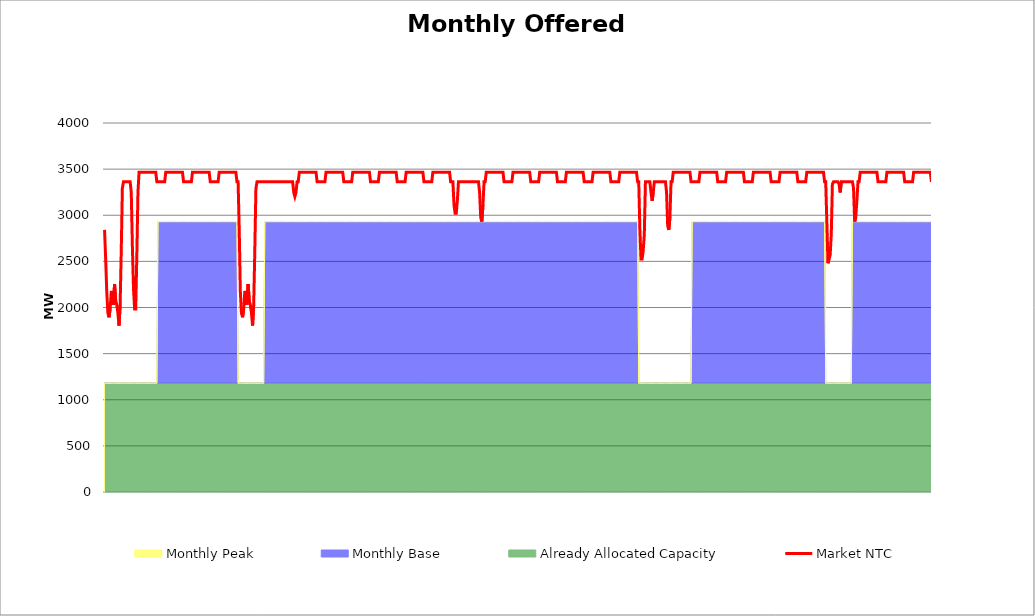
| Category | Market NTC |
|---|---|
| 0 | 2841 |
| 1 | 2525 |
| 2 | 2164 |
| 3 | 1939 |
| 4 | 1894 |
| 5 | 1984 |
| 6 | 2164 |
| 7 | 2164 |
| 8 | 2029 |
| 9 | 2255 |
| 10 | 2074 |
| 11 | 2029 |
| 12 | 1939 |
| 13 | 1804 |
| 14 | 2029 |
| 15 | 2615 |
| 16 | 3292 |
| 17 | 3362 |
| 18 | 3362 |
| 19 | 3362 |
| 20 | 3362 |
| 21 | 3362 |
| 22 | 3362 |
| 23 | 3362 |
| 24 | 3247 |
| 25 | 2661 |
| 26 | 2210 |
| 27 | 1984 |
| 28 | 1984 |
| 29 | 2570 |
| 30 | 3247 |
| 31 | 3466 |
| 32 | 3466 |
| 33 | 3466 |
| 34 | 3466 |
| 35 | 3466 |
| 36 | 3466 |
| 37 | 3466 |
| 38 | 3466 |
| 39 | 3466 |
| 40 | 3466 |
| 41 | 3466 |
| 42 | 3466 |
| 43 | 3466 |
| 44 | 3466 |
| 45 | 3466 |
| 46 | 3466 |
| 47 | 3362 |
| 48 | 3362 |
| 49 | 3362 |
| 50 | 3362 |
| 51 | 3362 |
| 52 | 3362 |
| 53 | 3362 |
| 54 | 3362 |
| 55 | 3466 |
| 56 | 3466 |
| 57 | 3466 |
| 58 | 3466 |
| 59 | 3466 |
| 60 | 3466 |
| 61 | 3466 |
| 62 | 3466 |
| 63 | 3466 |
| 64 | 3466 |
| 65 | 3466 |
| 66 | 3466 |
| 67 | 3466 |
| 68 | 3466 |
| 69 | 3466 |
| 70 | 3466 |
| 71 | 3362 |
| 72 | 3362 |
| 73 | 3362 |
| 74 | 3362 |
| 75 | 3362 |
| 76 | 3362 |
| 77 | 3362 |
| 78 | 3362 |
| 79 | 3466 |
| 80 | 3466 |
| 81 | 3466 |
| 82 | 3466 |
| 83 | 3466 |
| 84 | 3466 |
| 85 | 3466 |
| 86 | 3466 |
| 87 | 3466 |
| 88 | 3466 |
| 89 | 3466 |
| 90 | 3466 |
| 91 | 3466 |
| 92 | 3466 |
| 93 | 3466 |
| 94 | 3466 |
| 95 | 3362 |
| 96 | 3362 |
| 97 | 3362 |
| 98 | 3362 |
| 99 | 3362 |
| 100 | 3362 |
| 101 | 3362 |
| 102 | 3362 |
| 103 | 3466 |
| 104 | 3466 |
| 105 | 3466 |
| 106 | 3466 |
| 107 | 3466 |
| 108 | 3466 |
| 109 | 3466 |
| 110 | 3466 |
| 111 | 3466 |
| 112 | 3466 |
| 113 | 3466 |
| 114 | 3466 |
| 115 | 3466 |
| 116 | 3466 |
| 117 | 3466 |
| 118 | 3466 |
| 119 | 3362 |
| 120 | 3362 |
| 121 | 2850 |
| 122 | 2174 |
| 123 | 1939 |
| 124 | 1894 |
| 125 | 1984 |
| 126 | 2164 |
| 127 | 2164 |
| 128 | 2029 |
| 129 | 2255 |
| 130 | 2074 |
| 131 | 2029 |
| 132 | 1939 |
| 133 | 1804 |
| 134 | 2029 |
| 135 | 2615 |
| 136 | 3292 |
| 137 | 3362 |
| 138 | 3362 |
| 139 | 3362 |
| 140 | 3362 |
| 141 | 3362 |
| 142 | 3362 |
| 143 | 3362 |
| 144 | 3362 |
| 145 | 3362 |
| 146 | 3362 |
| 147 | 3362 |
| 148 | 3362 |
| 149 | 3362 |
| 150 | 3362 |
| 151 | 3362 |
| 152 | 3362 |
| 153 | 3362 |
| 154 | 3362 |
| 155 | 3362 |
| 156 | 3362 |
| 157 | 3362 |
| 158 | 3362 |
| 159 | 3362 |
| 160 | 3362 |
| 161 | 3362 |
| 162 | 3362 |
| 163 | 3362 |
| 164 | 3362 |
| 165 | 3362 |
| 166 | 3362 |
| 167 | 3362 |
| 168 | 3362 |
| 169 | 3362 |
| 170 | 3247 |
| 171 | 3202 |
| 172 | 3247 |
| 173 | 3362 |
| 174 | 3362 |
| 175 | 3466 |
| 176 | 3466 |
| 177 | 3466 |
| 178 | 3466 |
| 179 | 3466 |
| 180 | 3466 |
| 181 | 3466 |
| 182 | 3466 |
| 183 | 3466 |
| 184 | 3466 |
| 185 | 3466 |
| 186 | 3466 |
| 187 | 3466 |
| 188 | 3466 |
| 189 | 3466 |
| 190 | 3466 |
| 191 | 3362 |
| 192 | 3362 |
| 193 | 3362 |
| 194 | 3362 |
| 195 | 3362 |
| 196 | 3362 |
| 197 | 3362 |
| 198 | 3362 |
| 199 | 3466 |
| 200 | 3466 |
| 201 | 3466 |
| 202 | 3466 |
| 203 | 3466 |
| 204 | 3466 |
| 205 | 3466 |
| 206 | 3466 |
| 207 | 3466 |
| 208 | 3466 |
| 209 | 3466 |
| 210 | 3466 |
| 211 | 3466 |
| 212 | 3466 |
| 213 | 3466 |
| 214 | 3466 |
| 215 | 3362 |
| 216 | 3362 |
| 217 | 3362 |
| 218 | 3362 |
| 219 | 3362 |
| 220 | 3362 |
| 221 | 3362 |
| 222 | 3362 |
| 223 | 3466 |
| 224 | 3466 |
| 225 | 3466 |
| 226 | 3466 |
| 227 | 3466 |
| 228 | 3466 |
| 229 | 3466 |
| 230 | 3466 |
| 231 | 3466 |
| 232 | 3466 |
| 233 | 3466 |
| 234 | 3466 |
| 235 | 3466 |
| 236 | 3466 |
| 237 | 3466 |
| 238 | 3466 |
| 239 | 3362 |
| 240 | 3362 |
| 241 | 3362 |
| 242 | 3362 |
| 243 | 3362 |
| 244 | 3362 |
| 245 | 3362 |
| 246 | 3362 |
| 247 | 3466 |
| 248 | 3466 |
| 249 | 3466 |
| 250 | 3466 |
| 251 | 3466 |
| 252 | 3466 |
| 253 | 3466 |
| 254 | 3466 |
| 255 | 3466 |
| 256 | 3466 |
| 257 | 3466 |
| 258 | 3466 |
| 259 | 3466 |
| 260 | 3466 |
| 261 | 3466 |
| 262 | 3466 |
| 263 | 3362 |
| 264 | 3362 |
| 265 | 3362 |
| 266 | 3362 |
| 267 | 3362 |
| 268 | 3362 |
| 269 | 3362 |
| 270 | 3362 |
| 271 | 3466 |
| 272 | 3466 |
| 273 | 3466 |
| 274 | 3466 |
| 275 | 3466 |
| 276 | 3466 |
| 277 | 3466 |
| 278 | 3466 |
| 279 | 3466 |
| 280 | 3466 |
| 281 | 3466 |
| 282 | 3466 |
| 283 | 3466 |
| 284 | 3466 |
| 285 | 3466 |
| 286 | 3466 |
| 287 | 3362 |
| 288 | 3362 |
| 289 | 3362 |
| 290 | 3362 |
| 291 | 3362 |
| 292 | 3362 |
| 293 | 3362 |
| 294 | 3362 |
| 295 | 3466 |
| 296 | 3466 |
| 297 | 3466 |
| 298 | 3466 |
| 299 | 3466 |
| 300 | 3466 |
| 301 | 3466 |
| 302 | 3466 |
| 303 | 3466 |
| 304 | 3466 |
| 305 | 3466 |
| 306 | 3466 |
| 307 | 3466 |
| 308 | 3466 |
| 309 | 3466 |
| 310 | 3466 |
| 311 | 3362 |
| 312 | 3362 |
| 313 | 3362 |
| 314 | 3111 |
| 315 | 3021 |
| 316 | 3021 |
| 317 | 3157 |
| 318 | 3362 |
| 319 | 3362 |
| 320 | 3362 |
| 321 | 3362 |
| 322 | 3362 |
| 323 | 3362 |
| 324 | 3362 |
| 325 | 3362 |
| 326 | 3362 |
| 327 | 3362 |
| 328 | 3362 |
| 329 | 3362 |
| 330 | 3362 |
| 331 | 3362 |
| 332 | 3362 |
| 333 | 3362 |
| 334 | 3362 |
| 335 | 3362 |
| 336 | 3362 |
| 337 | 3247 |
| 338 | 2976 |
| 339 | 2931 |
| 340 | 3111 |
| 341 | 3362 |
| 342 | 3362 |
| 343 | 3466 |
| 344 | 3466 |
| 345 | 3466 |
| 346 | 3466 |
| 347 | 3466 |
| 348 | 3466 |
| 349 | 3466 |
| 350 | 3466 |
| 351 | 3466 |
| 352 | 3466 |
| 353 | 3466 |
| 354 | 3466 |
| 355 | 3466 |
| 356 | 3466 |
| 357 | 3466 |
| 358 | 3466 |
| 359 | 3362 |
| 360 | 3362 |
| 361 | 3362 |
| 362 | 3362 |
| 363 | 3362 |
| 364 | 3362 |
| 365 | 3362 |
| 366 | 3362 |
| 367 | 3466 |
| 368 | 3466 |
| 369 | 3466 |
| 370 | 3466 |
| 371 | 3466 |
| 372 | 3466 |
| 373 | 3466 |
| 374 | 3466 |
| 375 | 3466 |
| 376 | 3466 |
| 377 | 3466 |
| 378 | 3466 |
| 379 | 3466 |
| 380 | 3466 |
| 381 | 3466 |
| 382 | 3466 |
| 383 | 3362 |
| 384 | 3362 |
| 385 | 3362 |
| 386 | 3362 |
| 387 | 3362 |
| 388 | 3362 |
| 389 | 3362 |
| 390 | 3362 |
| 391 | 3466 |
| 392 | 3466 |
| 393 | 3466 |
| 394 | 3466 |
| 395 | 3466 |
| 396 | 3466 |
| 397 | 3466 |
| 398 | 3466 |
| 399 | 3466 |
| 400 | 3466 |
| 401 | 3466 |
| 402 | 3466 |
| 403 | 3466 |
| 404 | 3466 |
| 405 | 3466 |
| 406 | 3466 |
| 407 | 3362 |
| 408 | 3362 |
| 409 | 3362 |
| 410 | 3362 |
| 411 | 3362 |
| 412 | 3362 |
| 413 | 3362 |
| 414 | 3362 |
| 415 | 3466 |
| 416 | 3466 |
| 417 | 3466 |
| 418 | 3466 |
| 419 | 3466 |
| 420 | 3466 |
| 421 | 3466 |
| 422 | 3466 |
| 423 | 3466 |
| 424 | 3466 |
| 425 | 3466 |
| 426 | 3466 |
| 427 | 3466 |
| 428 | 3466 |
| 429 | 3466 |
| 430 | 3466 |
| 431 | 3362 |
| 432 | 3362 |
| 433 | 3362 |
| 434 | 3362 |
| 435 | 3362 |
| 436 | 3362 |
| 437 | 3362 |
| 438 | 3362 |
| 439 | 3466 |
| 440 | 3466 |
| 441 | 3466 |
| 442 | 3466 |
| 443 | 3466 |
| 444 | 3466 |
| 445 | 3466 |
| 446 | 3466 |
| 447 | 3466 |
| 448 | 3466 |
| 449 | 3466 |
| 450 | 3466 |
| 451 | 3466 |
| 452 | 3466 |
| 453 | 3466 |
| 454 | 3466 |
| 455 | 3362 |
| 456 | 3362 |
| 457 | 3362 |
| 458 | 3362 |
| 459 | 3362 |
| 460 | 3362 |
| 461 | 3362 |
| 462 | 3362 |
| 463 | 3466 |
| 464 | 3466 |
| 465 | 3466 |
| 466 | 3466 |
| 467 | 3466 |
| 468 | 3466 |
| 469 | 3466 |
| 470 | 3466 |
| 471 | 3466 |
| 472 | 3466 |
| 473 | 3466 |
| 474 | 3466 |
| 475 | 3466 |
| 476 | 3466 |
| 477 | 3466 |
| 478 | 3466 |
| 479 | 3362 |
| 480 | 3362 |
| 481 | 2850 |
| 482 | 2525 |
| 483 | 2525 |
| 484 | 2615 |
| 485 | 2796 |
| 486 | 3362 |
| 487 | 3362 |
| 488 | 3362 |
| 489 | 3362 |
| 490 | 3362 |
| 491 | 3247 |
| 492 | 3157 |
| 493 | 3247 |
| 494 | 3362 |
| 495 | 3362 |
| 496 | 3362 |
| 497 | 3362 |
| 498 | 3362 |
| 499 | 3362 |
| 500 | 3362 |
| 501 | 3362 |
| 502 | 3362 |
| 503 | 3362 |
| 504 | 3362 |
| 505 | 3247 |
| 506 | 2886 |
| 507 | 2841 |
| 508 | 2976 |
| 509 | 3362 |
| 510 | 3362 |
| 511 | 3466 |
| 512 | 3466 |
| 513 | 3466 |
| 514 | 3466 |
| 515 | 3466 |
| 516 | 3466 |
| 517 | 3466 |
| 518 | 3466 |
| 519 | 3466 |
| 520 | 3466 |
| 521 | 3466 |
| 522 | 3466 |
| 523 | 3466 |
| 524 | 3466 |
| 525 | 3466 |
| 526 | 3466 |
| 527 | 3362 |
| 528 | 3362 |
| 529 | 3362 |
| 530 | 3362 |
| 531 | 3362 |
| 532 | 3362 |
| 533 | 3362 |
| 534 | 3362 |
| 535 | 3466 |
| 536 | 3466 |
| 537 | 3466 |
| 538 | 3466 |
| 539 | 3466 |
| 540 | 3466 |
| 541 | 3466 |
| 542 | 3466 |
| 543 | 3466 |
| 544 | 3466 |
| 545 | 3466 |
| 546 | 3466 |
| 547 | 3466 |
| 548 | 3466 |
| 549 | 3466 |
| 550 | 3466 |
| 551 | 3362 |
| 552 | 3362 |
| 553 | 3362 |
| 554 | 3362 |
| 555 | 3362 |
| 556 | 3362 |
| 557 | 3362 |
| 558 | 3362 |
| 559 | 3466 |
| 560 | 3466 |
| 561 | 3466 |
| 562 | 3466 |
| 563 | 3466 |
| 564 | 3466 |
| 565 | 3466 |
| 566 | 3466 |
| 567 | 3466 |
| 568 | 3466 |
| 569 | 3466 |
| 570 | 3466 |
| 571 | 3466 |
| 572 | 3466 |
| 573 | 3466 |
| 574 | 3466 |
| 575 | 3362 |
| 576 | 3362 |
| 577 | 3362 |
| 578 | 3362 |
| 579 | 3362 |
| 580 | 3362 |
| 581 | 3362 |
| 582 | 3362 |
| 583 | 3466 |
| 584 | 3466 |
| 585 | 3466 |
| 586 | 3466 |
| 587 | 3466 |
| 588 | 3466 |
| 589 | 3466 |
| 590 | 3466 |
| 591 | 3466 |
| 592 | 3466 |
| 593 | 3466 |
| 594 | 3466 |
| 595 | 3466 |
| 596 | 3466 |
| 597 | 3466 |
| 598 | 3466 |
| 599 | 3362 |
| 600 | 3362 |
| 601 | 3362 |
| 602 | 3362 |
| 603 | 3362 |
| 604 | 3362 |
| 605 | 3362 |
| 606 | 3362 |
| 607 | 3466 |
| 608 | 3466 |
| 609 | 3466 |
| 610 | 3466 |
| 611 | 3466 |
| 612 | 3466 |
| 613 | 3466 |
| 614 | 3466 |
| 615 | 3466 |
| 616 | 3466 |
| 617 | 3466 |
| 618 | 3466 |
| 619 | 3466 |
| 620 | 3466 |
| 621 | 3466 |
| 622 | 3466 |
| 623 | 3362 |
| 624 | 3362 |
| 625 | 3362 |
| 626 | 3362 |
| 627 | 3362 |
| 628 | 3362 |
| 629 | 3362 |
| 630 | 3362 |
| 631 | 3466 |
| 632 | 3466 |
| 633 | 3466 |
| 634 | 3466 |
| 635 | 3466 |
| 636 | 3466 |
| 637 | 3466 |
| 638 | 3466 |
| 639 | 3466 |
| 640 | 3466 |
| 641 | 3466 |
| 642 | 3466 |
| 643 | 3466 |
| 644 | 3466 |
| 645 | 3466 |
| 646 | 3466 |
| 647 | 3362 |
| 648 | 3362 |
| 649 | 2931 |
| 650 | 2480 |
| 651 | 2525 |
| 652 | 2570 |
| 653 | 2796 |
| 654 | 3337 |
| 655 | 3362 |
| 656 | 3362 |
| 657 | 3362 |
| 658 | 3362 |
| 659 | 3362 |
| 660 | 3337 |
| 661 | 3247 |
| 662 | 3362 |
| 663 | 3362 |
| 664 | 3362 |
| 665 | 3362 |
| 666 | 3362 |
| 667 | 3362 |
| 668 | 3362 |
| 669 | 3362 |
| 670 | 3362 |
| 671 | 3362 |
| 672 | 3362 |
| 673 | 3292 |
| 674 | 2931 |
| 675 | 2976 |
| 676 | 3157 |
| 677 | 3362 |
| 678 | 3362 |
| 679 | 3466 |
| 680 | 3466 |
| 681 | 3466 |
| 682 | 3466 |
| 683 | 3466 |
| 684 | 3466 |
| 685 | 3466 |
| 686 | 3466 |
| 687 | 3466 |
| 688 | 3466 |
| 689 | 3466 |
| 690 | 3466 |
| 691 | 3466 |
| 692 | 3466 |
| 693 | 3466 |
| 694 | 3466 |
| 695 | 3362 |
| 696 | 3362 |
| 697 | 3362 |
| 698 | 3362 |
| 699 | 3362 |
| 700 | 3362 |
| 701 | 3362 |
| 702 | 3362 |
| 703 | 3466 |
| 704 | 3466 |
| 705 | 3466 |
| 706 | 3466 |
| 707 | 3466 |
| 708 | 3466 |
| 709 | 3466 |
| 710 | 3466 |
| 711 | 3466 |
| 712 | 3466 |
| 713 | 3466 |
| 714 | 3466 |
| 715 | 3466 |
| 716 | 3466 |
| 717 | 3466 |
| 718 | 3466 |
| 719 | 3362 |
| 720 | 3362 |
| 721 | 3362 |
| 722 | 3362 |
| 723 | 3362 |
| 724 | 3362 |
| 725 | 3362 |
| 726 | 3362 |
| 727 | 3466 |
| 728 | 3466 |
| 729 | 3466 |
| 730 | 3466 |
| 731 | 3466 |
| 732 | 3466 |
| 733 | 3466 |
| 734 | 3466 |
| 735 | 3466 |
| 736 | 3466 |
| 737 | 3466 |
| 738 | 3466 |
| 739 | 3466 |
| 740 | 3466 |
| 741 | 3466 |
| 742 | 3466 |
| 743 | 3362 |